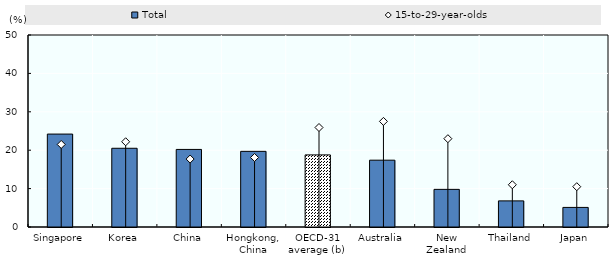
| Category | Total |
|---|---|
| 0 | 24.2 |
| 1 | 20.5 |
| 2 | 20.2 |
| 3 | 19.7 |
| 4 | 18.776 |
| 5 | 17.4 |
| 6 | 9.8 |
| 7 | 6.8 |
| 8 | 5.1 |